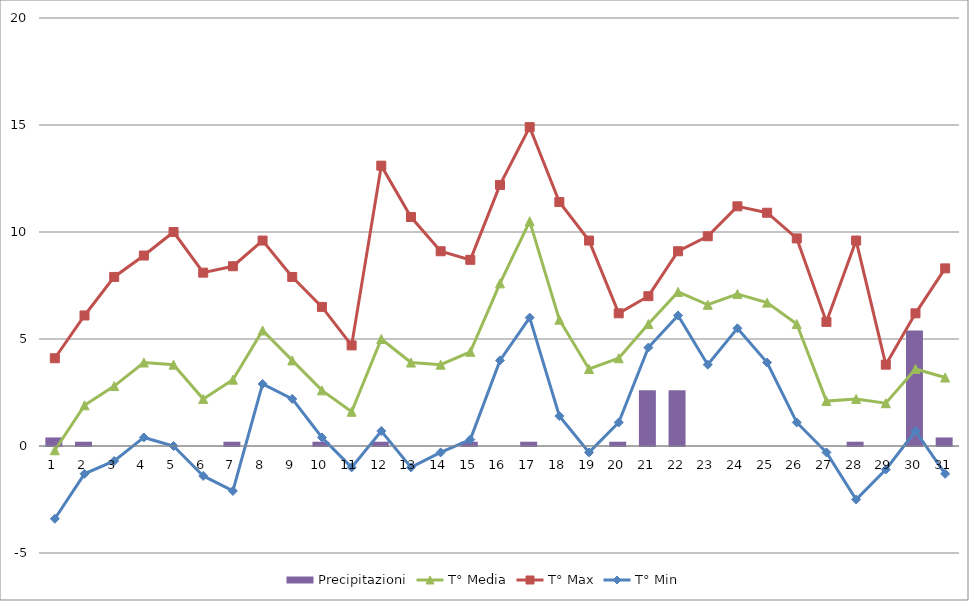
| Category | Precipitazioni |
|---|---|
| 0 | 0.4 |
| 1 | 0.2 |
| 2 | 0 |
| 3 | 0 |
| 4 | 0 |
| 5 | 0 |
| 6 | 0.2 |
| 7 | 0 |
| 8 | 0 |
| 9 | 0.2 |
| 10 | 0 |
| 11 | 0.2 |
| 12 | 0 |
| 13 | 0 |
| 14 | 0.2 |
| 15 | 0 |
| 16 | 0.2 |
| 17 | 0 |
| 18 | 0 |
| 19 | 0.2 |
| 20 | 2.6 |
| 21 | 2.6 |
| 22 | 0 |
| 23 | 0 |
| 24 | 0 |
| 25 | 0 |
| 26 | 0 |
| 27 | 0.2 |
| 28 | 0 |
| 29 | 5.4 |
| 30 | 0.4 |